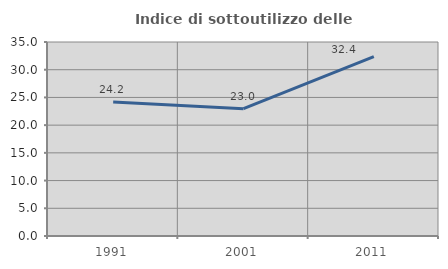
| Category | Indice di sottoutilizzo delle abitazioni  |
|---|---|
| 1991.0 | 24.194 |
| 2001.0 | 22.973 |
| 2011.0 | 32.353 |